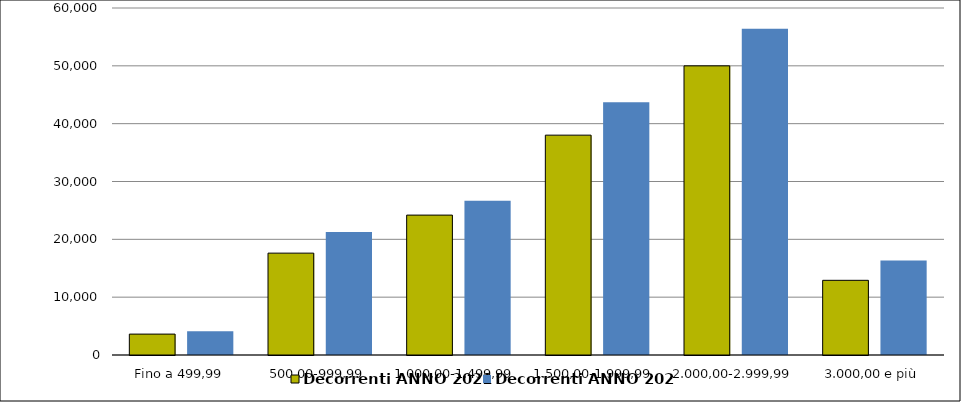
| Category | Decorrenti ANNO 2021 | Decorrenti ANNO 2020 |
|---|---|---|
|  Fino a 499,99  | 3613 | 4108 |
|  500,00-999,99  | 17615 | 21285 |
|  1.000,00-1.499,99  | 24190 | 26680 |
|  1.500,00-1.999,99  | 38016 | 43723 |
|  2.000,00-2.999,99  | 49996 | 56422 |
|  3.000,00 e più  | 12913 | 16354 |